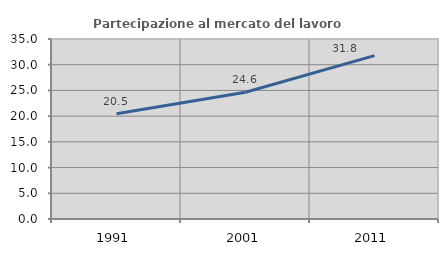
| Category | Partecipazione al mercato del lavoro  femminile |
|---|---|
| 1991.0 | 20.455 |
| 2001.0 | 24.638 |
| 2011.0 | 31.762 |